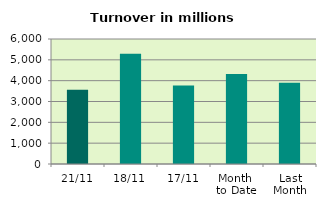
| Category | Series 0 |
|---|---|
| 21/11 | 3560.809 |
| 18/11 | 5297.787 |
| 17/11 | 3773.202 |
| Month 
to Date | 4316 |
| Last
Month | 3895.685 |